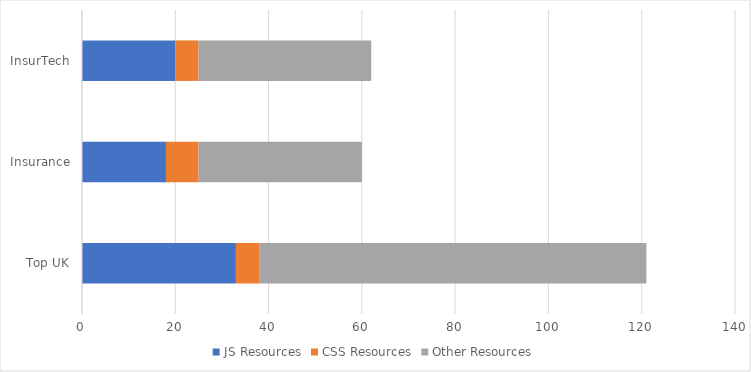
| Category | JS Resources | CSS Resources | Other Resources |
|---|---|---|---|
| Top UK | 33 | 5 | 83 |
| Insurance | 18 | 7 | 35 |
| InsurTech | 20 | 5 | 37 |